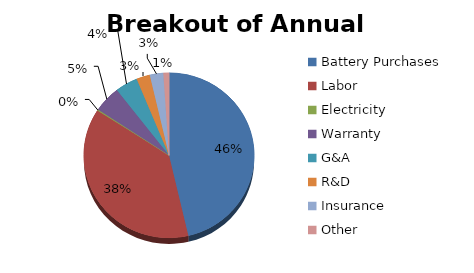
| Category | Series 0 |
|---|---|
| Battery Purchases | 19619765.279 |
| Labor | 15989002.68 |
| Electricity | 98328.502 |
| Warranty | 2192532.664 |
| G&A | 1807991.395 |
| R&D | 1084794.837 |
| Insurance | 1084794.837 |
| Other | 452731.431 |